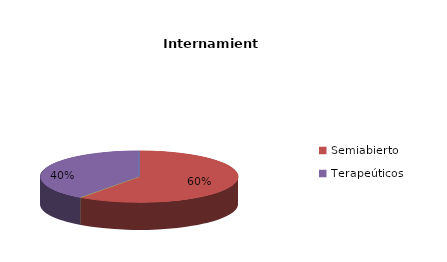
| Category | Series 0 |
|---|---|
| Cerrado | 0 |
| Semiabierto | 3 |
| Abierto | 0 |
| Terapeúticos | 2 |